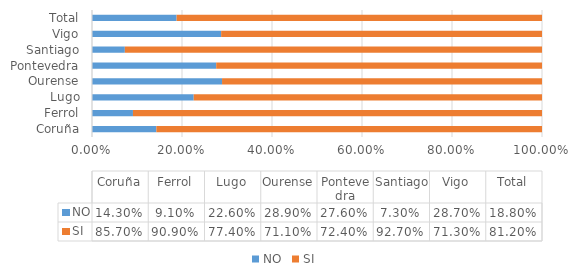
| Category | NO | SI |
|---|---|---|
| Coruña | 0.143 | 0.857 |
| Ferrol | 0.091 | 0.909 |
| Lugo | 0.226 | 0.774 |
| Ourense | 0.289 | 0.711 |
| Pontevedra | 0.276 | 0.724 |
| Santiago | 0.073 | 0.927 |
| Vigo | 0.287 | 0.713 |
| Total | 0.188 | 0.812 |